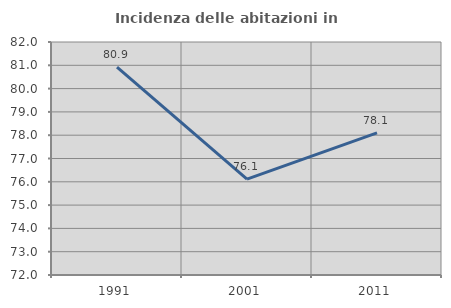
| Category | Incidenza delle abitazioni in proprietà  |
|---|---|
| 1991.0 | 80.925 |
| 2001.0 | 76.115 |
| 2011.0 | 78.102 |